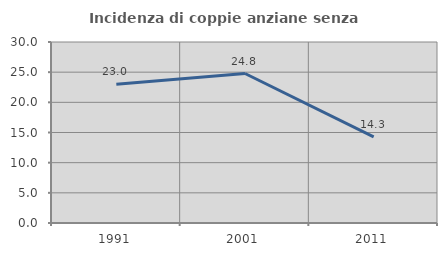
| Category | Incidenza di coppie anziane senza figli  |
|---|---|
| 1991.0 | 23.016 |
| 2001.0 | 24.779 |
| 2011.0 | 14.286 |